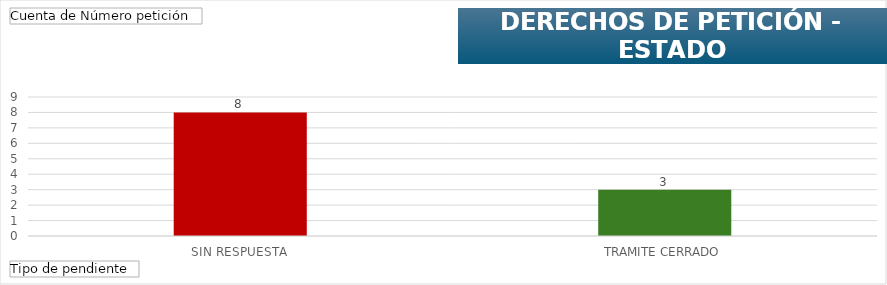
| Category | Total |
|---|---|
| SIN RESPUESTA | 8 |
| TRAMITE CERRADO | 3 |